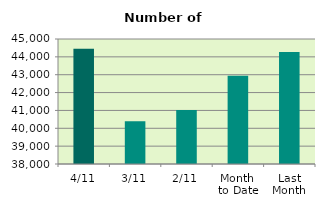
| Category | Series 0 |
|---|---|
| 4/11 | 44450 |
| 3/11 | 40396 |
| 2/11 | 41024 |
| Month 
to Date | 42936.5 |
| Last
Month | 44266.476 |